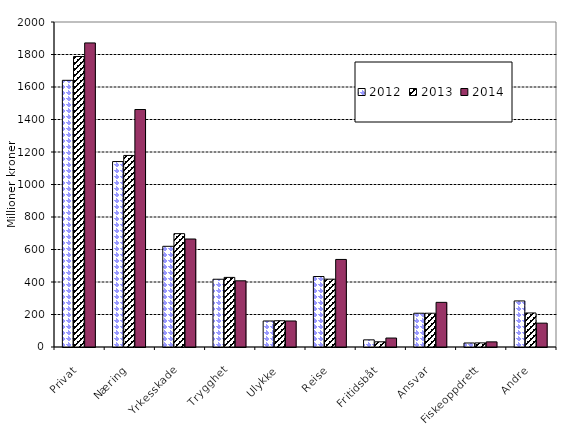
| Category | 2012 | 2013 | 2014 |
|---|---|---|---|
| Privat | 1641.133 | 1787.549 | 1871.231 |
| Næring | 1141.205 | 1178.758 | 1461.348 |
| Yrkesskade | 619.621 | 697.504 | 664.563 |
| Trygghet | 416.98 | 428.309 | 407.336 |
| Ulykke | 160.19 | 161.668 | 160.152 |
| Reise | 433.669 | 417.486 | 538.801 |
| Fritidsbåt | 43.997 | 31.948 | 55.152 |
| Ansvar | 207.818 | 207.845 | 274.756 |
| Fiskeoppdrett | 24.661 | 25.357 | 31.601 |
| Andre | 283.522 | 209.446 | 146.769 |